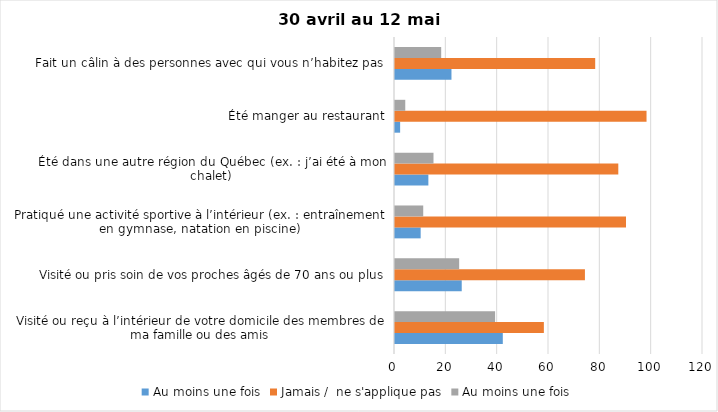
| Category | Au moins une fois | Jamais /  ne s'applique pas |
|---|---|---|
| Visité ou reçu à l’intérieur de votre domicile des membres de ma famille ou des amis | 39 | 58 |
| Visité ou pris soin de vos proches âgés de 70 ans ou plus | 25 | 74 |
| Pratiqué une activité sportive à l’intérieur (ex. : entraînement en gymnase, natation en piscine) | 11 | 90 |
| Été dans une autre région du Québec (ex. : j’ai été à mon chalet) | 15 | 87 |
| Été manger au restaurant | 4 | 98 |
| Fait un câlin à des personnes avec qui vous n’habitez pas | 18 | 78 |